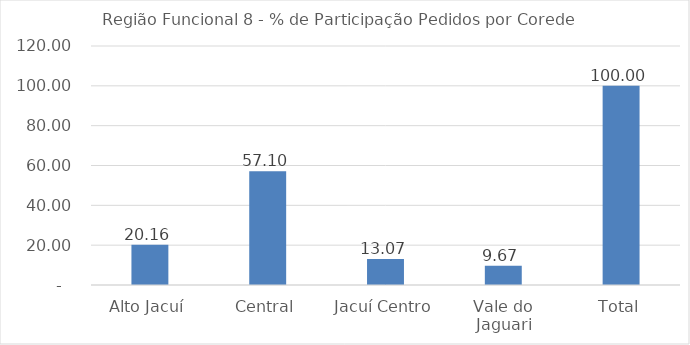
| Category | Series 0 |
|---|---|
| Alto Jacuí | 20.156 |
| Central | 57.096 |
| Jacuí Centro | 13.075 |
| Vale do Jaguari | 9.673 |
| Total | 100 |